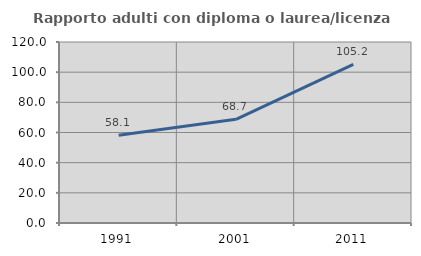
| Category | Rapporto adulti con diploma o laurea/licenza media  |
|---|---|
| 1991.0 | 58.108 |
| 2001.0 | 68.72 |
| 2011.0 | 105.15 |